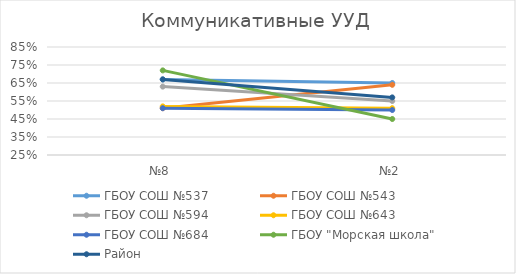
| Category | ГБОУ СОШ №537 | ГБОУ СОШ №543 | ГБОУ СОШ №594 | ГБОУ СОШ №643 | ГБОУ СОШ №684 | ГБОУ "Морская школа" | Район |
|---|---|---|---|---|---|---|---|
| №8 | 0.67 | 0.51 | 0.63 | 0.52 | 0.51 | 0.72 | 0.67 |
| №2 | 0.65 | 0.64 | 0.55 | 0.51 | 0.5 | 0.45 | 0.57 |